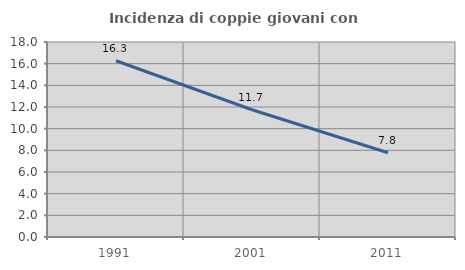
| Category | Incidenza di coppie giovani con figli |
|---|---|
| 1991.0 | 16.268 |
| 2001.0 | 11.747 |
| 2011.0 | 7.775 |